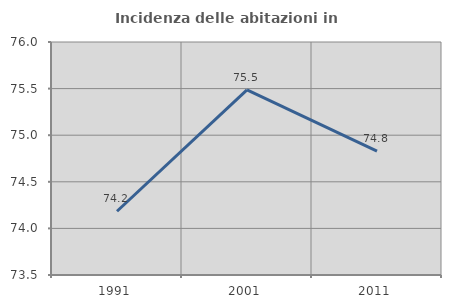
| Category | Incidenza delle abitazioni in proprietà  |
|---|---|
| 1991.0 | 74.184 |
| 2001.0 | 75.485 |
| 2011.0 | 74.829 |